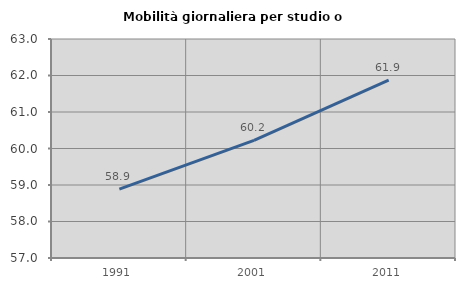
| Category | Mobilità giornaliera per studio o lavoro |
|---|---|
| 1991.0 | 58.887 |
| 2001.0 | 60.223 |
| 2011.0 | 61.871 |